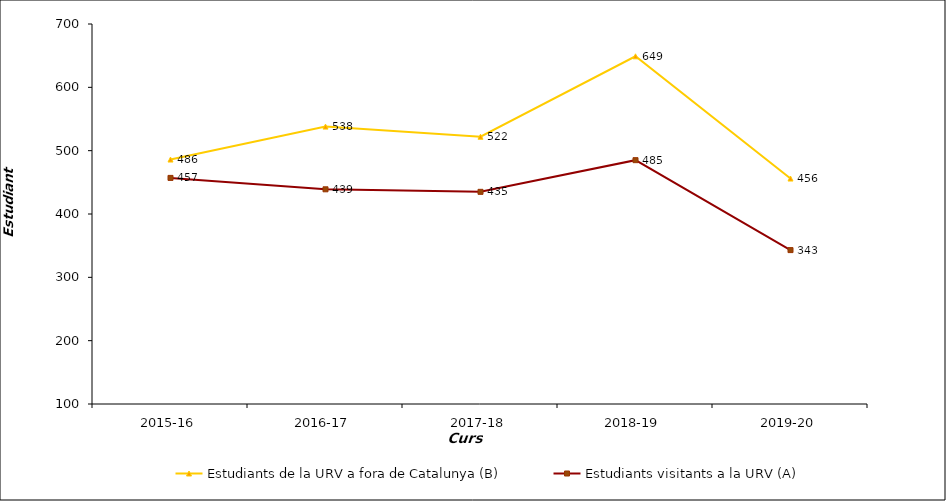
| Category | Estudiants de la URV a fora de Catalunya (B) | Estudiants visitants a la URV (A) |
|---|---|---|
| 2015-16 | 486 | 457 |
| 2016-17 | 538 | 439 |
| 2017-18 | 522 | 435 |
| 2018-19 | 649 | 485 |
| 2019-20 | 456 | 343 |